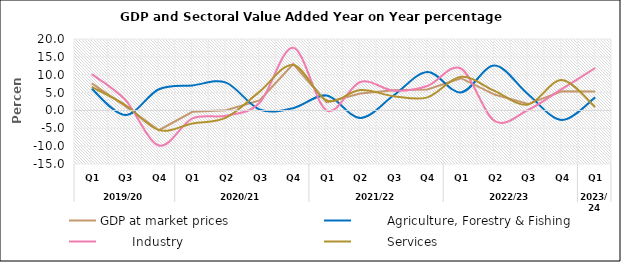
| Category | GDP at market prices |         Agriculture, Forestry & Fishing |         Industry |         Services |
|---|---|---|---|---|
| 0 | 7.555 | 6.034 | 10.167 | 6.567 |
| 1 | 1.199 | -1.29 | 2.951 | 1.522 |
| 2 | -5.545 | 5.922 | -9.798 | -5.506 |
| 3 | -0.386 | 7.004 | -2.233 | -3.638 |
| 4 | 0.042 | 7.792 | -1.484 | -2.01 |
| 5 | 2.801 | 0.261 | 2.153 | 5.274 |
| 6 | 12.981 | 0.638 | 17.541 | 12.727 |
| 7 | 2.276 | 4.178 | -0.035 | 2.794 |
| 8 | 4.752 | -2.099 | 7.977 | 5.741 |
| 9 | 5.643 | 4.238 | 5.54 | 3.989 |
| 10 | 5.89 | 10.753 | 6.82 | 3.644 |
| 11 | 9.018 | 5.051 | 11.74 | 9.435 |
| 12 | 4.451 | 12.566 | -2.951 | 5.465 |
| 13 | 1.783 | 4.527 | 0.125 | 1.639 |
| 14 | 5.366 | -2.671 | 5.942 | 8.508 |
| 15 | 5.295 | 3.648 | 11.879 | 0.952 |